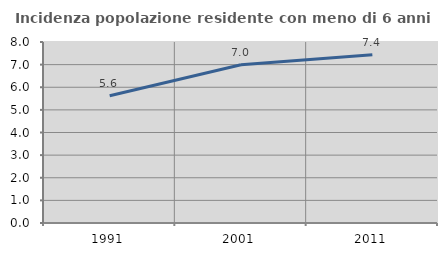
| Category | Incidenza popolazione residente con meno di 6 anni |
|---|---|
| 1991.0 | 5.628 |
| 2001.0 | 6.997 |
| 2011.0 | 7.434 |